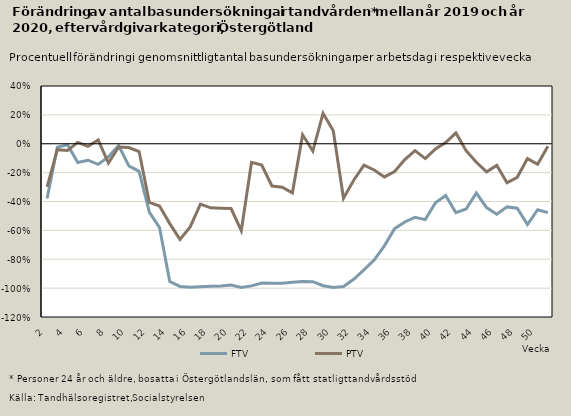
| Category | FTV | PTV |
|---|---|---|
| 2.0 | -0.38 | -0.299 |
| 3.0 | -0.023 | -0.041 |
| 4.0 | -0.007 | -0.047 |
| 5.0 | -0.13 | 0.009 |
| 6.0 | -0.114 | -0.018 |
| 7.0 | -0.142 | 0.026 |
| 8.0 | -0.091 | -0.134 |
| 9.0 | -0.013 | -0.022 |
| 10.0 | -0.154 | -0.027 |
| 11.0 | -0.191 | -0.054 |
| 12.0 | -0.474 | -0.406 |
| 13.0 | -0.58 | -0.431 |
| 14.0 | -0.954 | -0.553 |
| 15.0 | -0.988 | -0.662 |
| 16.0 | -0.994 | -0.576 |
| 17.0 | -0.99 | -0.418 |
| 18.0 | -0.987 | -0.444 |
| 19.0 | -0.985 | -0.446 |
| 20.0 | -0.979 | -0.449 |
| 21.0 | -0.996 | -0.602 |
| 22.0 | -0.984 | -0.129 |
| 23.0 | -0.965 | -0.148 |
| 24.0 | -0.966 | -0.293 |
| 25.0 | -0.966 | -0.301 |
| 26.0 | -0.959 | -0.34 |
| 27.0 | -0.954 | 0.062 |
| 28.0 | -0.955 | -0.051 |
| 29.0 | -0.983 | 0.211 |
| 30.0 | -0.996 | 0.089 |
| 31.0 | -0.989 | -0.378 |
| 32.0 | -0.939 | -0.253 |
| 33.0 | -0.874 | -0.148 |
| 34.0 | -0.806 | -0.182 |
| 35.0 | -0.707 | -0.23 |
| 36.0 | -0.588 | -0.192 |
| 37.0 | -0.542 | -0.11 |
| 38.0 | -0.509 | -0.048 |
| 39.0 | -0.525 | -0.103 |
| 40.0 | -0.408 | -0.035 |
| 41.0 | -0.358 | 0.008 |
| 42.0 | -0.478 | 0.075 |
| 43.0 | -0.452 | -0.048 |
| 44.0 | -0.341 | -0.128 |
| 45.0 | -0.442 | -0.194 |
| 46.0 | -0.488 | -0.15 |
| 47.0 | -0.437 | -0.271 |
| 48.0 | -0.447 | -0.233 |
| 49.0 | -0.56 | -0.103 |
| 50.0 | -0.457 | -0.142 |
| 51.0 | -0.477 | -0.017 |